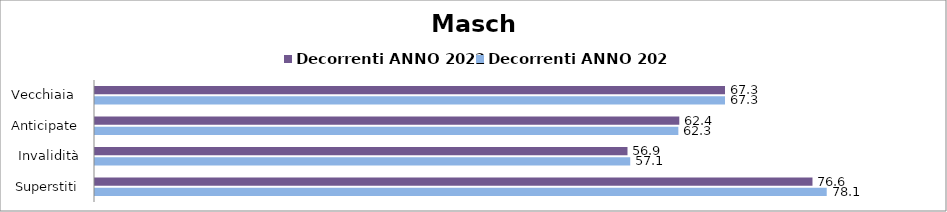
| Category | Decorrenti ANNO 2022 | Decorrenti ANNO 2023 |
|---|---|---|
| Vecchiaia  | 67.26 | 67.26 |
| Anticipate | 62.38 | 62.28 |
| Invalidità | 56.85 | 57.14 |
| Superstiti | 76.6 | 78.12 |